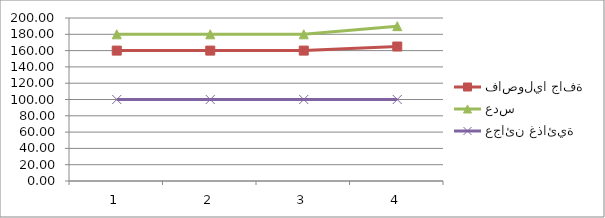
| Category | فاصوليا جافة | عدس | عجائن غذائية |
|---|---|---|---|
| 0 | 160 | 180 | 100 |
| 1 | 160 | 180 | 100 |
| 2 | 160 | 180 | 100 |
| 3 | 165 | 190 | 100 |